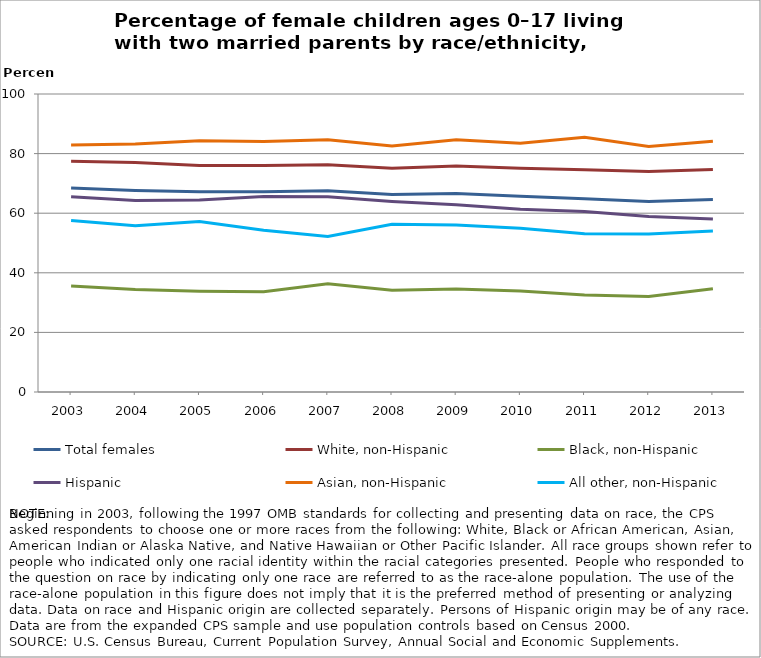
| Category | Total females | White, non-Hispanic | Black, non-Hispanic  | Hispanic | Asian, non-Hispanic | All other, non-Hispanic |
|---|---|---|---|---|---|---|
| 2003.0 | 68.466 | 77.396 | 35.562 | 65.482 | 82.878 | 57.519 |
| 2004.0 | 67.611 | 76.991 | 34.374 | 64.277 | 83.181 | 55.774 |
| 2005.0 | 67.174 | 76.047 | 33.793 | 64.426 | 84.353 | 57.214 |
| 2006.0 | 67.228 | 76.045 | 33.653 | 65.624 | 84.037 | 54.302 |
| 2007.0 | 67.564 | 76.254 | 36.326 | 65.486 | 84.663 | 52.204 |
| 2008.0 | 66.286 | 75.071 | 34.125 | 63.944 | 82.576 | 56.265 |
| 2009.0 | 66.597 | 75.869 | 34.603 | 62.869 | 84.639 | 56.054 |
| 2010.0 | 65.68 | 75.106 | 33.865 | 61.35 | 83.507 | 54.959 |
| 2011.0 | 64.885 | 74.594 | 32.515 | 60.551 | 85.455 | 53.136 |
| 2012.0 | 63.933 | 73.987 | 32.031 | 58.896 | 82.375 | 53.054 |
| 2013.0 | 64.571 | 74.66 | 34.668 | 58.067 | 84.163 | 54.012 |